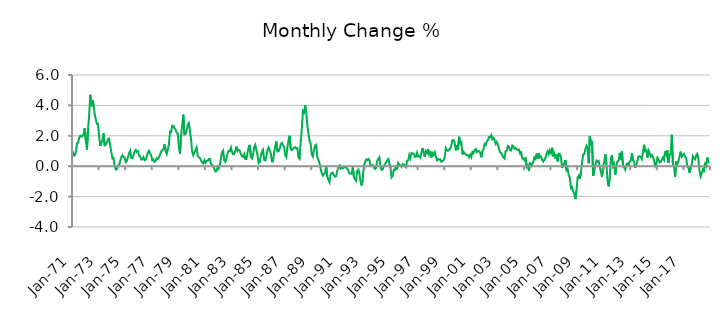
| Category | Series 0 |
|---|---|
| 1971-01-01 | 1.014 |
| 1971-02-01 | 0.711 |
| 1971-03-01 | 0.712 |
| 1971-04-01 | 0.919 |
| 1971-05-01 | 1.51 |
| 1971-06-01 | 1.551 |
| 1971-07-01 | 1.878 |
| 1971-08-01 | 2.005 |
| 1971-09-01 | 1.95 |
| 1971-10-01 | 1.987 |
| 1971-11-01 | 2.104 |
| 1971-12-01 | 2.509 |
| 1972-01-01 | 1.699 |
| 1972-02-01 | 1.094 |
| 1972-03-01 | 2.462 |
| 1972-04-01 | 3.36 |
| 1972-05-01 | 4.697 |
| 1972-06-01 | 3.937 |
| 1972-07-01 | 4.355 |
| 1972-08-01 | 4.026 |
| 1972-09-01 | 3.417 |
| 1972-10-01 | 3.088 |
| 1972-11-01 | 2.774 |
| 1972-12-01 | 2.784 |
| 1973-01-01 | 1.938 |
| 1973-02-01 | 1.343 |
| 1973-03-01 | 1.524 |
| 1973-04-01 | 1.712 |
| 1973-05-01 | 2.158 |
| 1973-06-01 | 1.373 |
| 1973-07-01 | 1.418 |
| 1973-08-01 | 1.551 |
| 1973-09-01 | 1.782 |
| 1973-10-01 | 1.816 |
| 1973-11-01 | 1.359 |
| 1973-12-01 | 0.961 |
| 1974-01-01 | 0.511 |
| 1974-02-01 | 0.548 |
| 1974-03-01 | -0.022 |
| 1974-04-01 | -0.216 |
| 1974-05-01 | -0.191 |
| 1974-06-01 | 0.007 |
| 1974-07-01 | 0.097 |
| 1974-08-01 | 0.326 |
| 1974-09-01 | 0.591 |
| 1974-10-01 | 0.722 |
| 1974-11-01 | 0.594 |
| 1974-12-01 | 0.583 |
| 1975-01-01 | 0.268 |
| 1975-02-01 | 0.337 |
| 1975-03-01 | 0.597 |
| 1975-04-01 | 0.845 |
| 1975-05-01 | 1.017 |
| 1975-06-01 | 0.539 |
| 1975-07-01 | 0.526 |
| 1975-08-01 | 0.722 |
| 1975-09-01 | 0.97 |
| 1975-10-01 | 1.067 |
| 1975-11-01 | 0.93 |
| 1975-12-01 | 0.985 |
| 1976-01-01 | 0.687 |
| 1976-02-01 | 0.643 |
| 1976-03-01 | 0.437 |
| 1976-04-01 | 0.463 |
| 1976-05-01 | 0.603 |
| 1976-06-01 | 0.392 |
| 1976-07-01 | 0.432 |
| 1976-08-01 | 0.636 |
| 1976-09-01 | 0.905 |
| 1976-10-01 | 1.011 |
| 1976-11-01 | 0.8 |
| 1976-12-01 | 0.709 |
| 1977-01-01 | 0.392 |
| 1977-02-01 | 0.448 |
| 1977-03-01 | 0.289 |
| 1977-04-01 | 0.338 |
| 1977-05-01 | 0.521 |
| 1977-06-01 | 0.47 |
| 1977-07-01 | 0.575 |
| 1977-08-01 | 0.784 |
| 1977-09-01 | 0.951 |
| 1977-10-01 | 1.061 |
| 1977-11-01 | 1.111 |
| 1977-12-01 | 1.434 |
| 1978-01-01 | 1.05 |
| 1978-02-01 | 0.811 |
| 1978-03-01 | 1.084 |
| 1978-04-01 | 1.443 |
| 1978-05-01 | 2.28 |
| 1978-06-01 | 2.255 |
| 1978-07-01 | 2.668 |
| 1978-08-01 | 2.665 |
| 1978-09-01 | 2.498 |
| 1978-10-01 | 2.424 |
| 1978-11-01 | 2.207 |
| 1978-12-01 | 2.133 |
| 1979-01-01 | 1.242 |
| 1979-02-01 | 0.823 |
| 1979-03-01 | 2.034 |
| 1979-04-01 | 2.732 |
| 1979-05-01 | 3.394 |
| 1979-06-01 | 2.083 |
| 1979-07-01 | 2.118 |
| 1979-08-01 | 2.335 |
| 1979-09-01 | 2.734 |
| 1979-10-01 | 2.841 |
| 1979-11-01 | 2.3 |
| 1979-12-01 | 1.747 |
| 1980-01-01 | 0.943 |
| 1980-02-01 | 0.726 |
| 1980-03-01 | 0.925 |
| 1980-04-01 | 1.073 |
| 1980-05-01 | 1.242 |
| 1980-06-01 | 0.656 |
| 1980-07-01 | 0.591 |
| 1980-08-01 | 0.543 |
| 1980-09-01 | 0.381 |
| 1980-10-01 | 0.243 |
| 1980-11-01 | 0.186 |
| 1980-12-01 | 0.395 |
| 1981-01-01 | 0.234 |
| 1981-02-01 | 0.354 |
| 1981-03-01 | 0.354 |
| 1981-04-01 | 0.474 |
| 1981-05-01 | 0.478 |
| 1981-06-01 | 0.161 |
| 1981-07-01 | 0.077 |
| 1981-08-01 | 0.019 |
| 1981-09-01 | -0.188 |
| 1981-10-01 | -0.344 |
| 1981-11-01 | -0.317 |
| 1981-12-01 | -0.035 |
| 1982-01-01 | -0.155 |
| 1982-02-01 | 0.068 |
| 1982-03-01 | 0.555 |
| 1982-04-01 | 0.929 |
| 1982-05-01 | 1.031 |
| 1982-06-01 | 0.372 |
| 1982-07-01 | 0.28 |
| 1982-08-01 | 0.532 |
| 1982-09-01 | 0.859 |
| 1982-10-01 | 1.012 |
| 1982-11-01 | 0.998 |
| 1982-12-01 | 1.225 |
| 1983-01-01 | 0.92 |
| 1983-02-01 | 0.783 |
| 1983-03-01 | 0.81 |
| 1983-04-01 | 0.995 |
| 1983-05-01 | 1.293 |
| 1983-06-01 | 1.001 |
| 1983-07-01 | 1.08 |
| 1983-08-01 | 1.015 |
| 1983-09-01 | 0.803 |
| 1983-10-01 | 0.652 |
| 1983-11-01 | 0.611 |
| 1983-12-01 | 0.798 |
| 1984-01-01 | 0.473 |
| 1984-02-01 | 0.478 |
| 1984-03-01 | 0.903 |
| 1984-04-01 | 1.241 |
| 1984-05-01 | 1.404 |
| 1984-06-01 | 0.614 |
| 1984-07-01 | 0.511 |
| 1984-08-01 | 0.774 |
| 1984-09-01 | 1.225 |
| 1984-10-01 | 1.401 |
| 1984-11-01 | 1.068 |
| 1984-12-01 | 0.734 |
| 1985-01-01 | 0.202 |
| 1985-02-01 | 0.279 |
| 1985-03-01 | 0.684 |
| 1985-04-01 | 0.954 |
| 1985-05-01 | 1.079 |
| 1985-06-01 | 0.413 |
| 1985-07-01 | 0.38 |
| 1985-08-01 | 0.656 |
| 1985-09-01 | 1.087 |
| 1985-10-01 | 1.228 |
| 1985-11-01 | 1.02 |
| 1985-12-01 | 0.807 |
| 1986-01-01 | 0.311 |
| 1986-02-01 | 0.317 |
| 1986-03-01 | 0.923 |
| 1986-04-01 | 1.322 |
| 1986-05-01 | 1.629 |
| 1986-06-01 | 0.97 |
| 1986-07-01 | 0.982 |
| 1986-08-01 | 1.161 |
| 1986-09-01 | 1.443 |
| 1986-10-01 | 1.536 |
| 1986-11-01 | 1.373 |
| 1986-12-01 | 1.263 |
| 1987-01-01 | 0.724 |
| 1987-02-01 | 0.595 |
| 1987-03-01 | 1.283 |
| 1987-04-01 | 1.705 |
| 1987-05-01 | 2.003 |
| 1987-06-01 | 1.108 |
| 1987-07-01 | 1.049 |
| 1987-08-01 | 1.142 |
| 1987-09-01 | 1.226 |
| 1987-10-01 | 1.253 |
| 1987-11-01 | 1.16 |
| 1987-12-01 | 1.188 |
| 1988-01-01 | 0.558 |
| 1988-02-01 | 0.478 |
| 1988-03-01 | 1.666 |
| 1988-04-01 | 2.466 |
| 1988-05-01 | 3.62 |
| 1988-06-01 | 3.526 |
| 1988-07-01 | 4.01 |
| 1988-08-01 | 3.546 |
| 1988-09-01 | 2.637 |
| 1988-10-01 | 2.133 |
| 1988-11-01 | 1.68 |
| 1988-12-01 | 1.467 |
| 1989-01-01 | 0.756 |
| 1989-02-01 | 0.634 |
| 1989-03-01 | 1.069 |
| 1989-04-01 | 1.347 |
| 1989-05-01 | 1.408 |
| 1989-06-01 | 0.607 |
| 1989-07-01 | 0.411 |
| 1989-08-01 | 0.192 |
| 1989-09-01 | -0.165 |
| 1989-10-01 | -0.462 |
| 1989-11-01 | -0.618 |
| 1989-12-01 | -0.507 |
| 1990-01-01 | -0.459 |
| 1990-02-01 | -0.019 |
| 1990-03-01 | -0.686 |
| 1990-04-01 | -0.897 |
| 1990-05-01 | -1.058 |
| 1990-06-01 | -0.51 |
| 1990-07-01 | -0.437 |
| 1990-08-01 | -0.428 |
| 1990-09-01 | -0.604 |
| 1990-10-01 | -0.695 |
| 1990-11-01 | -0.649 |
| 1990-12-01 | -0.278 |
| 1991-01-01 | -0.196 |
| 1991-02-01 | 0.105 |
| 1991-03-01 | -0.159 |
| 1991-04-01 | -0.105 |
| 1991-05-01 | -0.139 |
| 1991-06-01 | -0.062 |
| 1991-07-01 | -0.066 |
| 1991-08-01 | -0.093 |
| 1991-09-01 | -0.159 |
| 1991-10-01 | -0.285 |
| 1991-11-01 | -0.467 |
| 1991-12-01 | -0.497 |
| 1992-01-01 | -0.494 |
| 1992-02-01 | -0.076 |
| 1992-03-01 | -0.697 |
| 1992-04-01 | -0.848 |
| 1992-05-01 | -0.944 |
| 1992-06-01 | -0.312 |
| 1992-07-01 | -0.225 |
| 1992-08-01 | -0.473 |
| 1992-09-01 | -1.015 |
| 1992-10-01 | -1.272 |
| 1992-11-01 | -0.873 |
| 1992-12-01 | 0.026 |
| 1993-01-01 | 0.247 |
| 1993-02-01 | 0.437 |
| 1993-03-01 | 0.391 |
| 1993-04-01 | 0.487 |
| 1993-05-01 | 0.413 |
| 1993-06-01 | 0.047 |
| 1993-07-01 | 0.03 |
| 1993-08-01 | 0.082 |
| 1993-09-01 | -0.063 |
| 1993-10-01 | -0.18 |
| 1993-11-01 | -0.118 |
| 1993-12-01 | 0.35 |
| 1994-01-01 | 0.48 |
| 1994-02-01 | 0.595 |
| 1994-03-01 | -0.023 |
| 1994-04-01 | -0.241 |
| 1994-05-01 | -0.212 |
| 1994-06-01 | 0.019 |
| 1994-07-01 | 0.12 |
| 1994-08-01 | 0.247 |
| 1994-09-01 | 0.391 |
| 1994-10-01 | 0.472 |
| 1994-11-01 | 0.222 |
| 1994-12-01 | -0.131 |
| 1995-01-01 | -0.733 |
| 1995-02-01 | -0.635 |
| 1995-03-01 | -0.24 |
| 1995-04-01 | -0.251 |
| 1995-05-01 | 0.043 |
| 1995-06-01 | -0.212 |
| 1995-07-01 | 0.218 |
| 1995-08-01 | 0.097 |
| 1995-09-01 | 0.057 |
| 1995-10-01 | -0.036 |
| 1995-11-01 | 0.126 |
| 1995-12-01 | 0.123 |
| 1996-01-01 | 0.036 |
| 1996-02-01 | -0.061 |
| 1996-03-01 | 0.33 |
| 1996-04-01 | 0.389 |
| 1996-05-01 | 0.736 |
| 1996-06-01 | 0.535 |
| 1996-07-01 | 0.868 |
| 1996-08-01 | 0.833 |
| 1996-09-01 | 0.834 |
| 1996-10-01 | 0.603 |
| 1996-11-01 | 0.635 |
| 1996-12-01 | 0.892 |
| 1997-01-01 | 0.634 |
| 1997-02-01 | 0.672 |
| 1997-03-01 | 0.57 |
| 1997-04-01 | 0.919 |
| 1997-05-01 | 1.19 |
| 1997-06-01 | 0.893 |
| 1997-07-01 | 0.625 |
| 1997-08-01 | 0.99 |
| 1997-09-01 | 0.877 |
| 1997-10-01 | 1.126 |
| 1997-11-01 | 0.779 |
| 1997-12-01 | 0.981 |
| 1998-01-01 | 0.576 |
| 1998-02-01 | 0.861 |
| 1998-03-01 | 0.744 |
| 1998-04-01 | 0.917 |
| 1998-05-01 | 0.646 |
| 1998-06-01 | 0.394 |
| 1998-07-01 | 0.47 |
| 1998-08-01 | 0.438 |
| 1998-09-01 | 0.441 |
| 1998-10-01 | 0.291 |
| 1998-11-01 | 0.339 |
| 1998-12-01 | 0.406 |
| 1999-01-01 | 0.599 |
| 1999-02-01 | 1.189 |
| 1999-03-01 | 1.036 |
| 1999-04-01 | 1.017 |
| 1999-05-01 | 1.102 |
| 1999-06-01 | 1.154 |
| 1999-07-01 | 1.343 |
| 1999-08-01 | 1.715 |
| 1999-09-01 | 1.719 |
| 1999-10-01 | 1.552 |
| 1999-11-01 | 1.038 |
| 1999-12-01 | 1.38 |
| 2000-01-01 | 1.085 |
| 2000-02-01 | 1.936 |
| 2000-03-01 | 1.491 |
| 2000-04-01 | 1.566 |
| 2000-05-01 | 0.781 |
| 2000-06-01 | 0.949 |
| 2000-07-01 | 0.839 |
| 2000-08-01 | 0.775 |
| 2000-09-01 | 0.714 |
| 2000-10-01 | 0.729 |
| 2000-11-01 | 0.596 |
| 2000-12-01 | 0.754 |
| 2001-01-01 | 0.606 |
| 2001-02-01 | 0.935 |
| 2001-03-01 | 0.867 |
| 2001-04-01 | 1.055 |
| 2001-05-01 | 1.127 |
| 2001-06-01 | 0.924 |
| 2001-07-01 | 0.998 |
| 2001-08-01 | 0.985 |
| 2001-09-01 | 0.883 |
| 2001-10-01 | 0.588 |
| 2001-11-01 | 0.997 |
| 2001-12-01 | 1.094 |
| 2002-01-01 | 1.445 |
| 2002-02-01 | 1.384 |
| 2002-03-01 | 1.631 |
| 2002-04-01 | 1.728 |
| 2002-05-01 | 1.918 |
| 2002-06-01 | 1.906 |
| 2002-07-01 | 2.048 |
| 2002-08-01 | 1.783 |
| 2002-09-01 | 1.859 |
| 2002-10-01 | 1.71 |
| 2002-11-01 | 1.477 |
| 2002-12-01 | 1.602 |
| 2003-01-01 | 1.407 |
| 2003-02-01 | 1.139 |
| 2003-03-01 | 0.91 |
| 2003-04-01 | 0.863 |
| 2003-05-01 | 0.726 |
| 2003-06-01 | 0.579 |
| 2003-07-01 | 0.508 |
| 2003-08-01 | 0.993 |
| 2003-09-01 | 1.027 |
| 2003-10-01 | 1.329 |
| 2003-11-01 | 1.273 |
| 2003-12-01 | 1.053 |
| 2004-01-01 | 1.036 |
| 2004-02-01 | 1.359 |
| 2004-03-01 | 1.319 |
| 2004-04-01 | 1.15 |
| 2004-05-01 | 1.201 |
| 2004-06-01 | 1.108 |
| 2004-07-01 | 1.051 |
| 2004-08-01 | 1.089 |
| 2004-09-01 | 0.842 |
| 2004-10-01 | 0.907 |
| 2004-11-01 | 0.505 |
| 2004-12-01 | 0.511 |
| 2005-01-01 | 0.398 |
| 2005-02-01 | 0.577 |
| 2005-03-01 | -0.053 |
| 2005-04-01 | 0.04 |
| 2005-05-01 | -0.312 |
| 2005-06-01 | 0.26 |
| 2005-07-01 | 0.004 |
| 2005-08-01 | 0.128 |
| 2005-09-01 | 0.297 |
| 2005-10-01 | 0.584 |
| 2005-11-01 | 0.486 |
| 2005-12-01 | 0.828 |
| 2006-01-01 | 0.509 |
| 2006-02-01 | 0.838 |
| 2006-03-01 | 0.586 |
| 2006-04-01 | 0.628 |
| 2006-05-01 | 0.405 |
| 2006-06-01 | 0.306 |
| 2006-07-01 | 0.429 |
| 2006-08-01 | 0.565 |
| 2006-09-01 | 0.835 |
| 2006-10-01 | 0.993 |
| 2006-11-01 | 0.798 |
| 2006-12-01 | 1.047 |
| 2007-01-01 | 0.861 |
| 2007-02-01 | 1.212 |
| 2007-03-01 | 0.649 |
| 2007-04-01 | 0.826 |
| 2007-05-01 | 0.491 |
| 2007-06-01 | 0.782 |
| 2007-07-01 | 0.32 |
| 2007-08-01 | 0.81 |
| 2007-09-01 | 0.786 |
| 2007-10-01 | 0.574 |
| 2007-11-01 | -0.113 |
| 2007-12-01 | 0.076 |
| 2008-01-01 | 0.196 |
| 2008-02-01 | 0.402 |
| 2008-03-01 | -0.271 |
| 2008-04-01 | -0.188 |
| 2008-05-01 | -0.619 |
| 2008-06-01 | -0.782 |
| 2008-07-01 | -1.451 |
| 2008-08-01 | -1.382 |
| 2008-09-01 | -1.671 |
| 2008-10-01 | -1.826 |
| 2008-11-01 | -2.159 |
| 2008-12-01 | -1.562 |
| 2009-01-01 | -0.738 |
| 2009-02-01 | -0.617 |
| 2009-03-01 | -0.835 |
| 2009-04-01 | -0.421 |
| 2009-05-01 | 0.239 |
| 2009-06-01 | 0.777 |
| 2009-07-01 | 0.802 |
| 2009-08-01 | 1.131 |
| 2009-09-01 | 1.337 |
| 2009-10-01 | 1.165 |
| 2009-11-01 | 0.197 |
| 2009-12-01 | 1.981 |
| 2010-01-01 | 1.519 |
| 2010-02-01 | 1.677 |
| 2010-03-01 | -0.627 |
| 2010-04-01 | -0.325 |
| 2010-05-01 | 0.094 |
| 2010-06-01 | 0.367 |
| 2010-07-01 | 0.291 |
| 2010-08-01 | 0.34 |
| 2010-09-01 | -0.022 |
| 2010-10-01 | -0.376 |
| 2010-11-01 | -0.713 |
| 2010-12-01 | 0.005 |
| 2011-01-01 | 0.246 |
| 2011-02-01 | 0.789 |
| 2011-03-01 | 0.128 |
| 2011-04-01 | -0.968 |
| 2011-05-01 | -1.323 |
| 2011-06-01 | -0.728 |
| 2011-07-01 | 0.512 |
| 2011-08-01 | 0.726 |
| 2011-09-01 | -0.007 |
| 2011-10-01 | 0.137 |
| 2011-11-01 | -0.567 |
| 2011-12-01 | 0.039 |
| 2012-01-01 | 0.326 |
| 2012-02-01 | 0.35 |
| 2012-03-01 | 0.876 |
| 2012-04-01 | 0.41 |
| 2012-05-01 | 0.988 |
| 2012-06-01 | 0.006 |
| 2012-07-01 | -0.085 |
| 2012-08-01 | -0.229 |
| 2012-09-01 | 0.128 |
| 2012-10-01 | 0.179 |
| 2012-11-01 | 0.065 |
| 2012-12-01 | 0.317 |
| 2013-01-01 | 0.353 |
| 2013-02-01 | 0.856 |
| 2013-03-01 | 0.386 |
| 2013-04-01 | 0.274 |
| 2013-05-01 | -0.099 |
| 2013-06-01 | 0.123 |
| 2013-07-01 | 0.372 |
| 2013-08-01 | 0.658 |
| 2013-09-01 | 0.643 |
| 2013-10-01 | 0.632 |
| 2013-11-01 | 0.471 |
| 2013-12-01 | 0.925 |
| 2014-01-01 | 1.406 |
| 2014-02-01 | 0.988 |
| 2014-03-01 | 1.041 |
| 2014-04-01 | 0.572 |
| 2014-05-01 | 1.019 |
| 2014-06-01 | 0.845 |
| 2014-07-01 | 0.633 |
| 2014-08-01 | 0.738 |
| 2014-09-01 | 0.591 |
| 2014-10-01 | 0.374 |
| 2014-11-01 | 0.005 |
| 2014-12-01 | 0.104 |
| 2015-01-01 | 0.566 |
| 2015-02-01 | 0.477 |
| 2015-03-01 | 0.246 |
| 2015-04-01 | 0.268 |
| 2015-05-01 | 0.427 |
| 2015-06-01 | 0.575 |
| 2015-07-01 | 0.419 |
| 2015-08-01 | 0.978 |
| 2015-09-01 | 0.752 |
| 2015-10-01 | 1.06 |
| 2015-11-01 | 0.234 |
| 2015-12-01 | 0.779 |
| 2016-01-01 | 0.813 |
| 2016-02-01 | 2.068 |
| 2016-03-01 | 0.187 |
| 2016-04-01 | -0.005 |
| 2016-05-01 | -0.701 |
| 2016-06-01 | 0.306 |
| 2016-07-01 | 0.133 |
| 2016-08-01 | 0.302 |
| 2016-09-01 | 0.654 |
| 2016-10-01 | 0.961 |
| 2016-11-01 | 0.631 |
| 2016-12-01 | 0.742 |
| 2017-01-01 | 0.814 |
| 2017-02-01 | 0.634 |
| 2017-03-01 | 0.538 |
| 2017-04-01 | -0.03 |
| 2017-05-01 | -0.081 |
| 2017-06-01 | -0.44 |
| 2017-07-01 | -0.104 |
| 2017-08-01 | 0.117 |
| 2017-09-01 | 0.655 |
| 2017-10-01 | 0.523 |
| 2017-11-01 | 0.454 |
| 2017-12-01 | 0.709 |
| 2018-01-01 | 0.811 |
| 2018-02-01 | 0.465 |
| 2018-03-01 | -0.291 |
| 2018-04-01 | -0.682 |
| 2018-05-01 | -0.488 |
| 2018-06-01 | -0.196 |
| 2018-07-01 | -0.309 |
| 2018-08-01 | 0.135 |
| 2018-09-01 | 0.008 |
| 2018-10-01 | 0.568 |
| 2018-11-01 | 0.255 |
| 2018-12-01 | 0.287 |